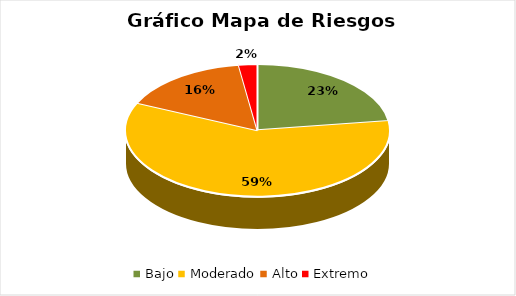
| Category | Series 0 |
|---|---|
| Bajo | 0.227 |
| Moderado | 0.591 |
| Alto | 0.159 |
| Extremo | 0.023 |